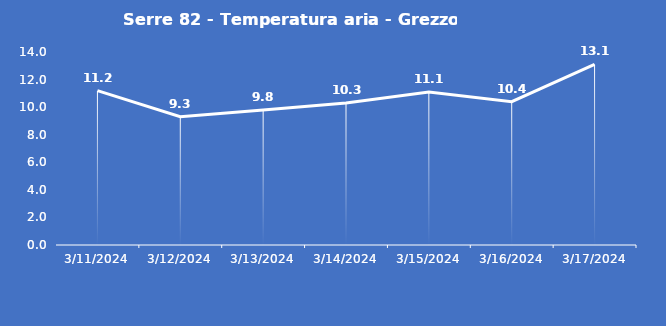
| Category | Serre 82 - Temperatura aria - Grezzo (°C) |
|---|---|
| 3/11/24 | 11.2 |
| 3/12/24 | 9.3 |
| 3/13/24 | 9.8 |
| 3/14/24 | 10.3 |
| 3/15/24 | 11.1 |
| 3/16/24 | 10.4 |
| 3/17/24 | 13.1 |